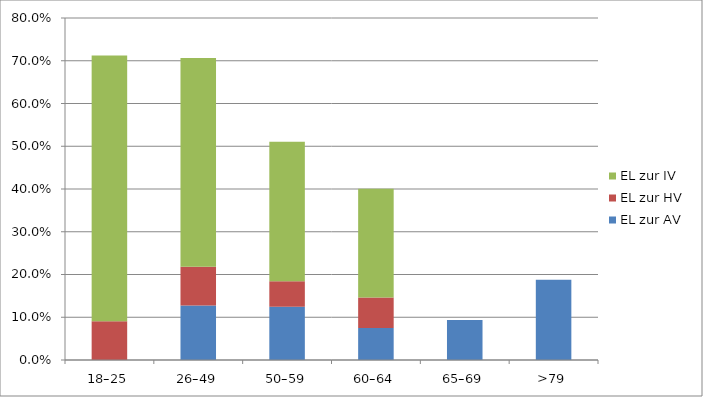
| Category | EL zur AV | EL zur HV | EL zur IV |
|---|---|---|---|
| 18–25 | 0 | 0.091 | 0.621 |
| 26–49 | 0.128 | 0.091 | 0.488 |
| 50–59 | 0.124 | 0.06 | 0.326 |
| 60–64 | 0.075 | 0.071 | 0.255 |
| 65–69 | 0.094 | 0 | 0 |
| >79 | 0.187 | 0 | 0 |